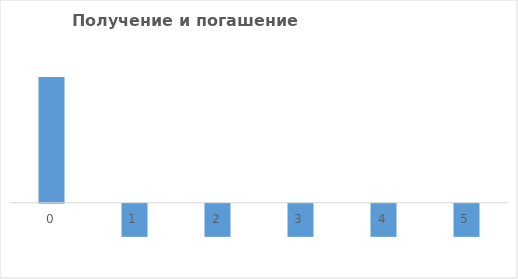
| Category | Series 0 |
|---|---|
| 0.0 | 3.791 |
| 1.0 | -1 |
| 2.0 | -1 |
| 3.0 | -1 |
| 4.0 | -1 |
| 5.0 | -1 |